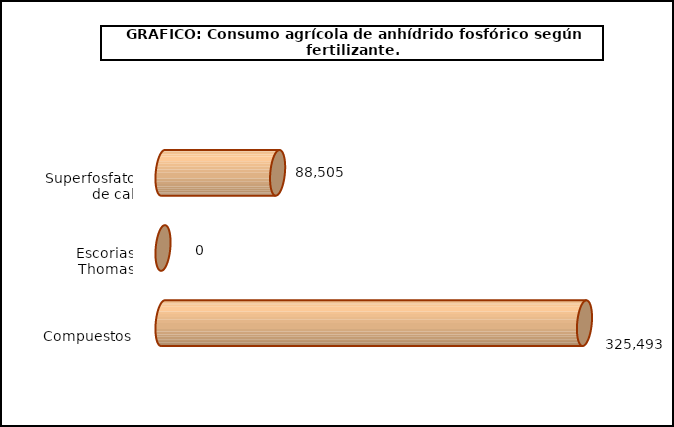
| Category | fert. N |
|---|---|
| 0 | 88505 |
| 1 | 0 |
| 2 | 325493 |